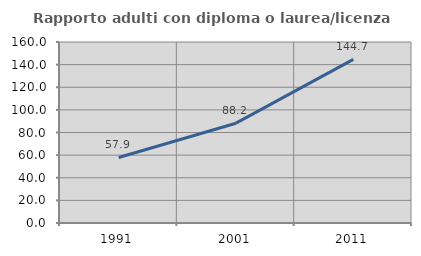
| Category | Rapporto adulti con diploma o laurea/licenza media  |
|---|---|
| 1991.0 | 57.937 |
| 2001.0 | 88.232 |
| 2011.0 | 144.669 |